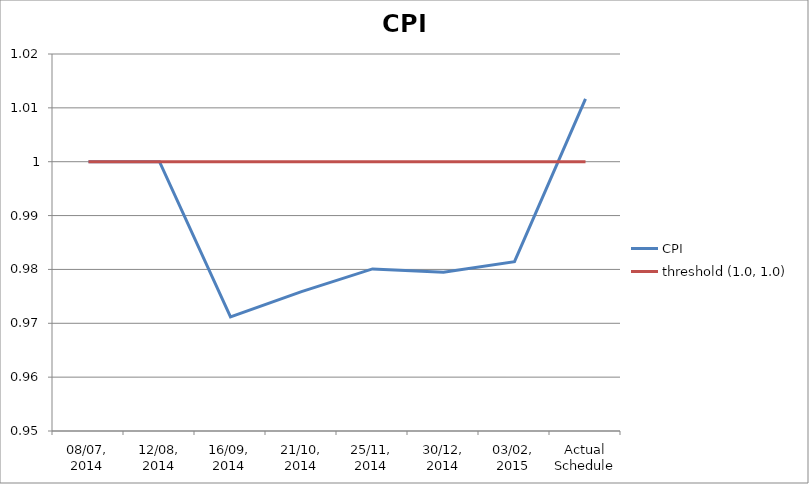
| Category | CPI | threshold (1.0, 1.0) |
|---|---|---|
| 08/07, 2014 | 1 | 1 |
| 12/08, 2014 | 1 | 1 |
| 16/09, 2014 | 0.971 | 1 |
| 21/10, 2014 | 0.976 | 1 |
| 25/11, 2014 | 0.98 | 1 |
| 30/12, 2014 | 0.979 | 1 |
| 03/02, 2015 | 0.981 | 1 |
| Actual Schedule | 1.012 | 1 |